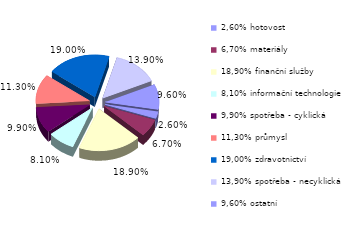
| Category | Series 0 |
|---|---|
| 2,60% hotovost | 0.026 |
| 6,70% materiály | 0.067 |
| 18,90% finanční služby | 0.189 |
| 8,10% informační technologie | 0.081 |
| 9,90% spotřeba - cyklická | 0.099 |
| 11,30% průmysl | 0.113 |
| 19,00% zdravotnictví | 0.19 |
| 13,90% spotřeba - necyklická | 0.139 |
| 9,60% ostatní | 0.096 |